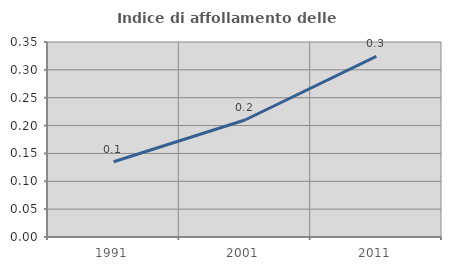
| Category | Indice di affollamento delle abitazioni  |
|---|---|
| 1991.0 | 0.135 |
| 2001.0 | 0.21 |
| 2011.0 | 0.324 |